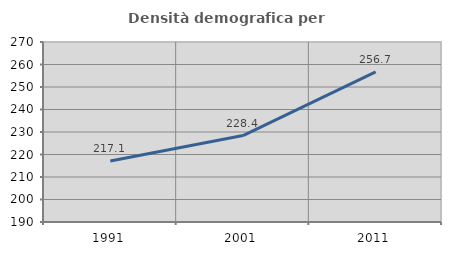
| Category | Densità demografica |
|---|---|
| 1991.0 | 217.076 |
| 2001.0 | 228.42 |
| 2011.0 | 256.702 |